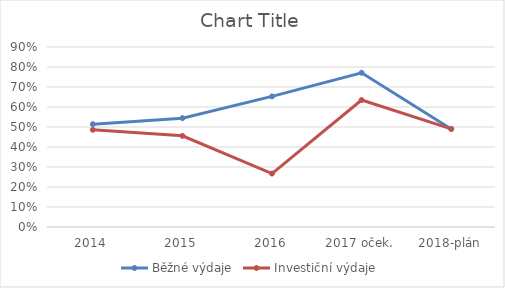
| Category | Běžné výdaje | Investiční výdaje  |
|---|---|---|
| 2014 | 0.514 | 0.486 |
| 2015 | 0.544 | 0.456 |
| 2016 | 0.653 | 0.267 |
| 2017 oček. | 0.771 | 0.635 |
| 2018-plán | 0.49 | 0.49 |